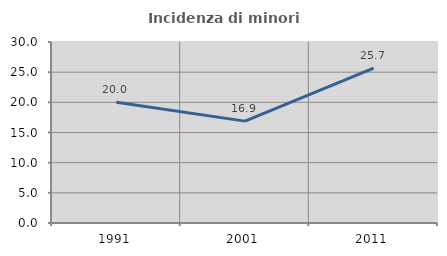
| Category | Incidenza di minori stranieri |
|---|---|
| 1991.0 | 20 |
| 2001.0 | 16.883 |
| 2011.0 | 25.658 |